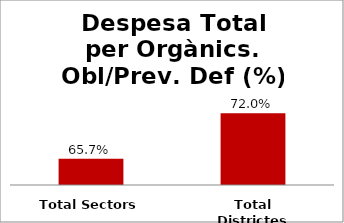
| Category | Series 0 |
|---|---|
| Total Sectors | 0.657 |
| Total Districtes | 0.72 |